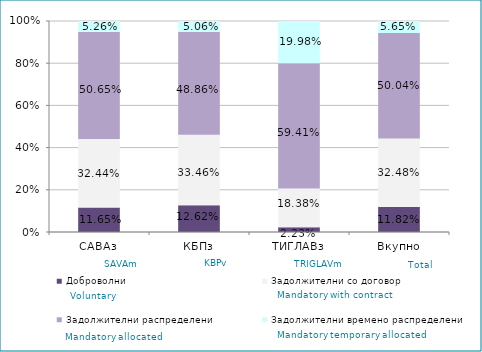
| Category | Доброволни  | Задолжителни со договор  | Задолжителни распределени  | Задолжителни времено распределени  |
|---|---|---|---|---|
| САВАз | 0.117 | 0.324 | 0.506 | 0.053 |
| КБПз | 0.126 | 0.335 | 0.489 | 0.051 |
| ТИГЛАВз | 0.022 | 0.184 | 0.594 | 0.2 |
| Вкупно | 0.118 | 0.325 | 0.5 | 0.056 |